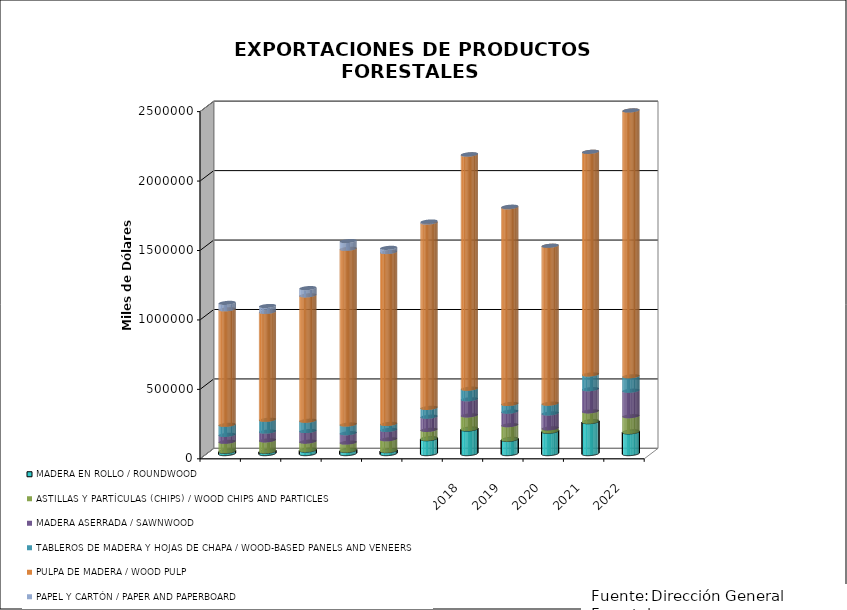
| Category | MADERA EN ROLLO / ROUNDWOOD | ASTILLAS Y PARTÍCULAS (CHIPS) / WOOD CHIPS AND PARTICLES | MADERA ASERRADA / SAWNWOOD | TABLEROS DE MADERA Y HOJAS DE CHAPA / WOOD-BASED PANELS AND VENEERS | PULPA DE MADERA / WOOD PULP | PAPEL Y CARTÓN / PAPER AND PAPERBOARD |
|---|---|---|---|---|---|---|
| 2012.0 | 16680.044 | 68513.092 | 49849.714 | 72462.709 | 831723 | 46110.602 |
| 2013.0 | 16444.714 | 79055.851 | 63406.496 | 84892.809 | 776892 | 42274.253 |
| 2014.0 | 25498.069 | 60902 | 76173 | 74476.2 | 902625 | 52104.041 |
| 2015.0 | 23228 | 56515.9 | 67526.12 | 62565.051 | 1265039 | 55503.106 |
| 2016.0 | 21441.491 | 82012.199 | 67450.715 | 43013.766 | 1237373.001 | 30296.831 |
| 2017.0 | 107635.378 | 63438.939 | 94796.221 | 63676.239 | 1334290.973 | 7338.058 |
| 2018.0 | 177188.701 | 98065.019 | 116192.403 | 76314.018 | 1684874.59 | 3089.729 |
| 2019.0 | 102777.212 | 102201.241 | 97337.11 | 55497.84 | 1415990.069 | 4039.125 |
| 2020.0 | 161323.765 | 20911.384 | 107229.901 | 70518.902 | 1136380 | 523.253 |
| 2021.0 | 230125.294 | 74209.066 | 159724.592 | 106035.668 | 1602664.525 | 341.238 |
| 2022.0 | 156556.406 | 112950.73 | 183534.317 | 104103.177 | 1913547.624 | 247.817 |